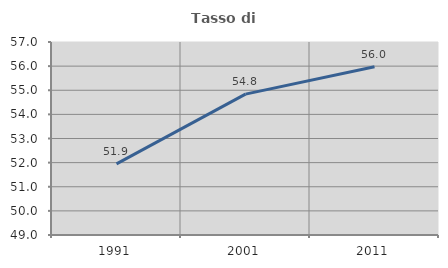
| Category | Tasso di occupazione   |
|---|---|
| 1991.0 | 51.946 |
| 2001.0 | 54.841 |
| 2011.0 | 55.971 |